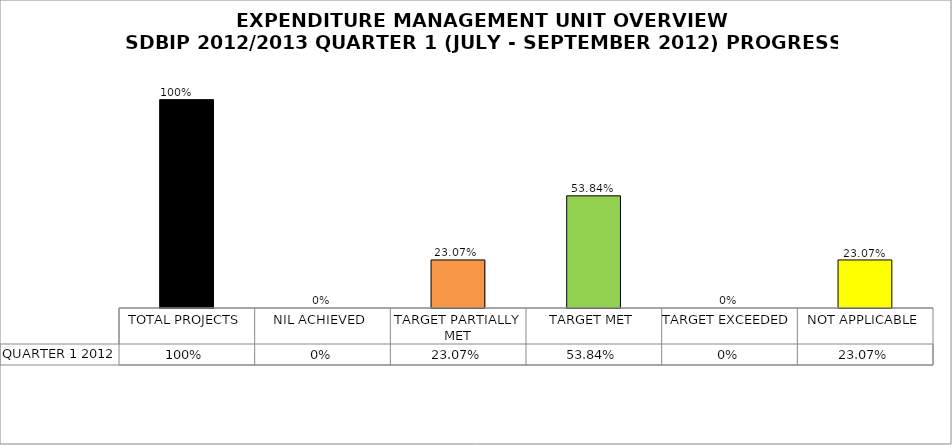
| Category | QUARTER 1 2012 |
|---|---|
| TOTAL PROJECTS | 1 |
| NIL ACHIEVED | 0 |
| TARGET PARTIALLY MET | 0.231 |
| TARGET MET | 0.538 |
| TARGET EXCEEDED | 0 |
| NOT APPLICABLE | 0.231 |